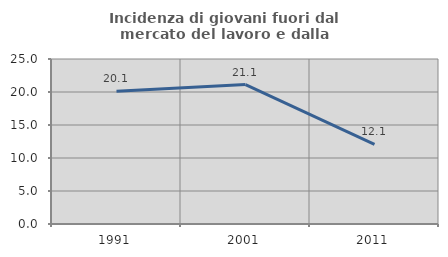
| Category | Incidenza di giovani fuori dal mercato del lavoro e dalla formazione  |
|---|---|
| 1991.0 | 20.13 |
| 2001.0 | 21.118 |
| 2011.0 | 12.069 |